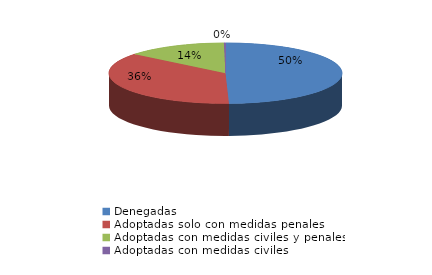
| Category | Series 0 |
|---|---|
| Denegadas | 2435 |
| Adoptadas solo con medidas penales | 1784 |
| Adoptadas con medidas civiles y penales | 686 |
| Adoptadas con medidas civiles | 11 |